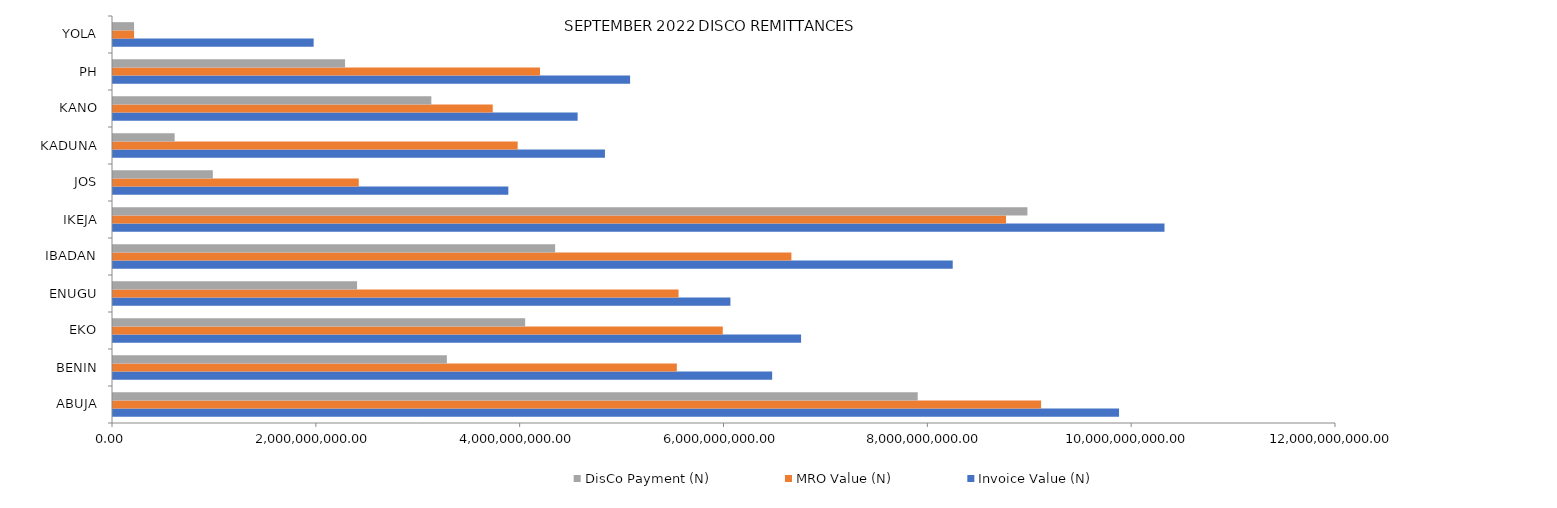
| Category | Invoice Value (N) | MRO Value (N) | DisCo Payment (N) |
|---|---|---|---|
| ABUJA | 9871279557.737 | 9106255392.012 | 7895844655.41 |
| BENIN | 6467566163.811 | 5532356096.524 | 3276037180.05 |
| EKO | 6751331673.719 | 5983030129.25 | 4044040556.99 |
| ENUGU | 6057973181.578 | 5549103434.326 | 2394768838.62 |
| IBADAN | 8239171225.174 | 6656426432.818 | 4338238050.67 |
| IKEJA | 10317122630.299 | 8762332249.913 | 8972147870.28 |
| JOS | 3878911505.381 | 2411519282.896 | 979280507.86 |
| KADUNA | 4826839642.956 | 3970558290.296 | 604748535.42 |
| KANO | 4558933713.155 | 3726016523.761 | 3123496567.56 |
| PH | 5073636599.342 | 4189809103.737 | 2276896657.68 |
| YOLA | 1968868496.753 | 206731192.159 | 206731192.16 |